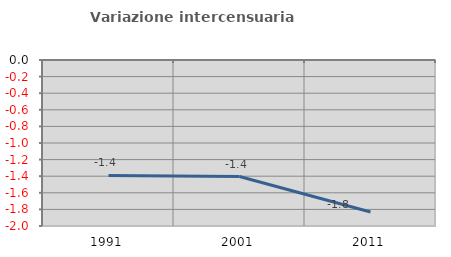
| Category | Variazione intercensuaria annua |
|---|---|
| 1991.0 | -1.391 |
| 2001.0 | -1.404 |
| 2011.0 | -1.831 |